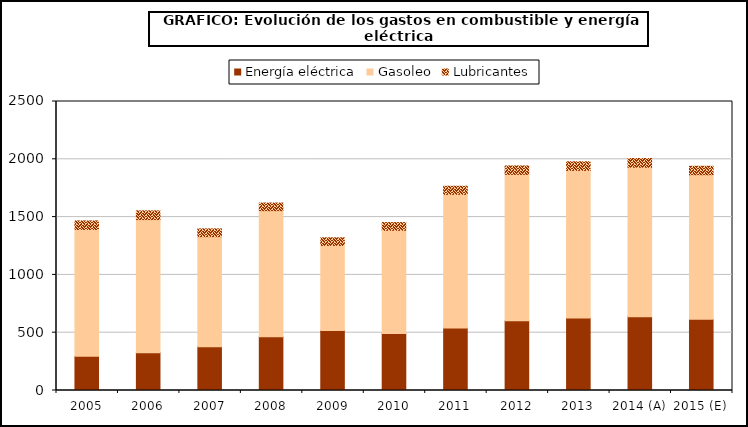
| Category | Energía eléctrica | Gasoleo | Lubricantes |
|---|---|---|---|
| 2005 | 295.787 | 1096.919 | 74.037 |
| 2006 | 325.85 | 1152.791 | 75.344 |
| 2007 | 379.292 | 951.283 | 67.537 |
| 2008 | 465.509 | 1089.777 | 66.177 |
| 2009 | 519.861 | 735.254 | 65.464 |
| 2010 | 492.737 | 892.822 | 66.957 |
| 2011 | 541.39 | 1155.464 | 70.222 |
| 2012 | 602.887 | 1266.655 | 72.753 |
| 2013 | 628.022 | 1275.795 | 74.642 |
| 2014 (A) | 637.082 | 1294.199 | 75.719 |
| 2015 (E) | 615.691 | 1250.744 | 73.177 |